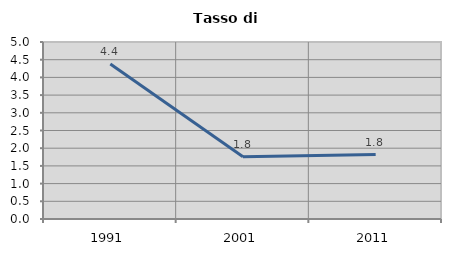
| Category | Tasso di disoccupazione   |
|---|---|
| 1991.0 | 4.377 |
| 2001.0 | 1.756 |
| 2011.0 | 1.822 |